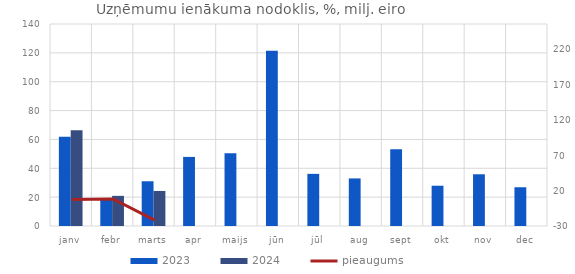
| Category | 2023 | 2024 |
|---|---|---|
| janv | 61.791 | 66.341 |
| febr | 19.323 | 20.888 |
| marts | 31.008 | 24.281 |
| apr | 47.876 | 0 |
| maijs | 50.345 | 0 |
| jūn | 121.503 | 0 |
| jūl | 36.144 | 0 |
| aug | 32.976 | 0 |
| sept | 53.222 | 0 |
| okt | 27.91 | 0 |
| nov | 35.855 | 0 |
| dec | 26.857 | 0 |